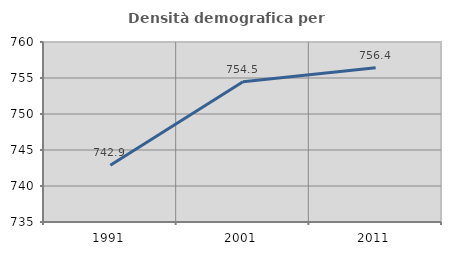
| Category | Densità demografica |
|---|---|
| 1991.0 | 742.886 |
| 2001.0 | 754.487 |
| 2011.0 | 756.428 |